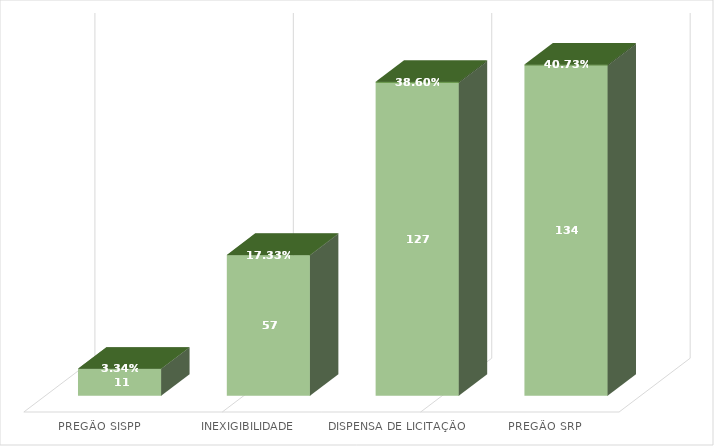
| Category | Contagem de Pedido nº | Contagem de Pedido nº2 |
|---|---|---|
| PREGÃO SISPP | 11 | 0.033 |
| INEXIGIBILIDADE | 57 | 0.173 |
| DISPENSA DE LICITAÇÃO | 127 | 0.386 |
| PREGÃO SRP | 134 | 0.407 |